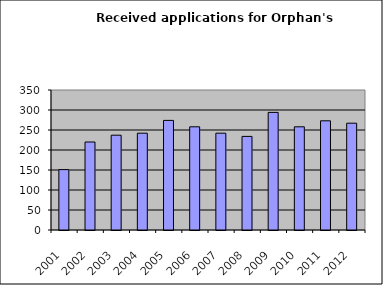
| Category | Series 1 |
|---|---|
| 2001.0 | 151 |
| 2002.0 | 220 |
| 2003.0 | 237 |
| 2004.0 | 242 |
| 2005.0 | 274 |
| 2006.0 | 258 |
| 2007.0 | 242 |
| 2008.0 | 234 |
| 2009.0 | 294 |
| 2010.0 | 258 |
| 2011.0 | 273 |
| 2012.0 | 267 |